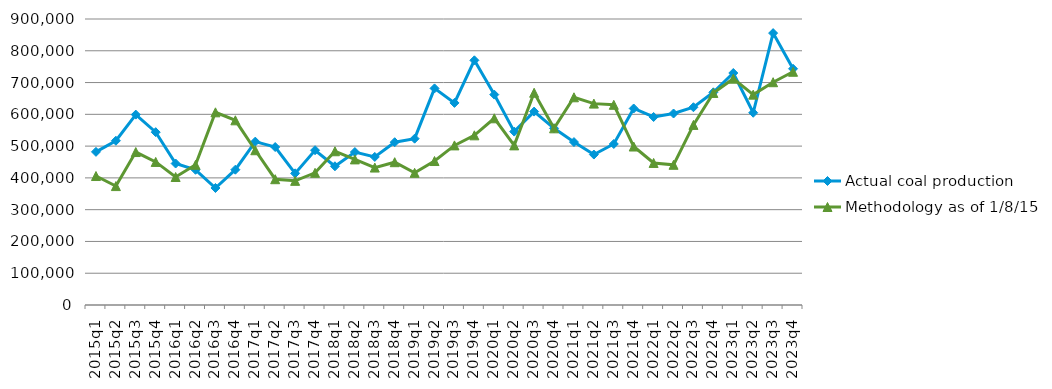
| Category | Actual coal production | Methodology as of 1/8/15 |
|---|---|---|
| 2015q1 | 481917 | 405890 |
| 2015q2 | 516831 | 374229 |
| 2015q3 | 599161 | 481367 |
| 2015q4 | 543867 | 450240 |
| 2016q1 | 445188 | 402778 |
| 2016q2 | 425491 | 441080 |
| 2016q3 | 368222 | 606351 |
| 2016q4 | 425769 | 581165 |
| 2017q1 | 514115 | 486981 |
| 2017q2 | 497097 | 395849 |
| 2017q3 | 414211 | 390701 |
| 2017q4 | 487075 | 415938 |
| 2018q1 | 436526 | 483781 |
| 2018q2 | 481312 | 458169 |
| 2018q3 | 465945 | 432462 |
| 2018q4 | 512255 | 449399 |
| 2019q1 | 523414 | 415851 |
| 2019q2 | 681623 | 453076 |
| 2019q3 | 635931 | 502244 |
| 2019q4 | 769969 | 533890 |
| 2020q1 | 662113 | 587563 |
| 2020q2 | 545650 | 502271 |
| 2020q3 | 608665 | 667932 |
| 2020q4 | 555989 | 555989 |
| 2021q1 | 512730 | 653641 |
| 2021q2 | 473410 | 633700 |
| 2021q3 | 506712 | 629987 |
| 2021q4 | 618389 | 498680 |
| 2022q1 | 591647 | 447009 |
| 2022q2 | 602594 | 441178 |
| 2022q3 | 622375 | 566764 |
| 2022q4 | 669289 | 667283 |
| 2023q1 | 730036 | 712209 |
| 2023q2 | 604976 | 662007 |
| 2023q3 | 855586 | 701066 |
| 2023q4 | 743388 | 733936 |